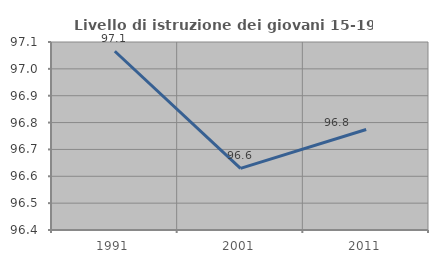
| Category | Livello di istruzione dei giovani 15-19 anni |
|---|---|
| 1991.0 | 97.065 |
| 2001.0 | 96.629 |
| 2011.0 | 96.774 |